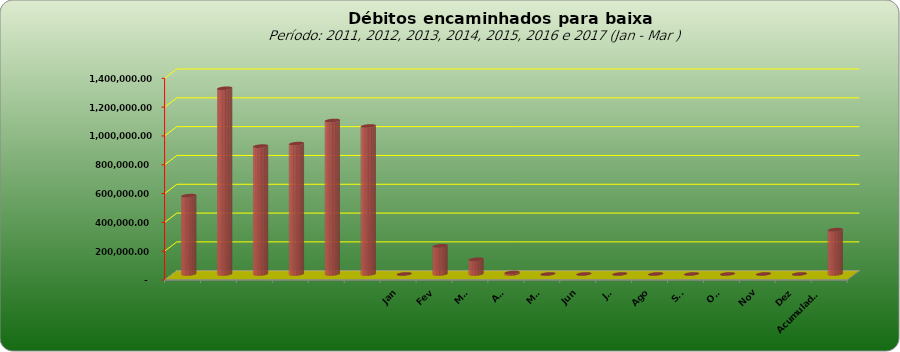
| Category |  543.796,20  |
|---|---|
|  | 543796.2 |
|  | 1289053.69 |
|  | 887573.08 |
|  | 905052.31 |
|  | 1065434.28 |
|  | 1027209.41 |
| Jan | 0 |
| Fev | 195564.55 |
| Mar | 101757.11 |
| Abr | 10195.55 |
| Mai | 0 |
| Jun | 0 |
| Jul | 0 |
| Ago | 0 |
| Set | 0 |
| Out | 0 |
| Nov | 0 |
| Dez | 0 |
| Acumulado
2016 | 307517.21 |